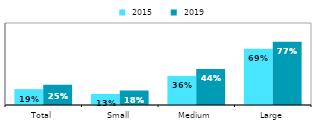
| Category |  2015 |  2019 |
|---|---|---|
| Total | 0.194 | 0.247 |
| Small | 0.134 | 0.177 |
| Medium | 0.355 | 0.44 |
| Large | 0.687 | 0.771 |